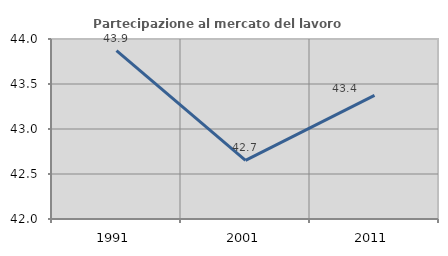
| Category | Partecipazione al mercato del lavoro  femminile |
|---|---|
| 1991.0 | 43.871 |
| 2001.0 | 42.652 |
| 2011.0 | 43.373 |